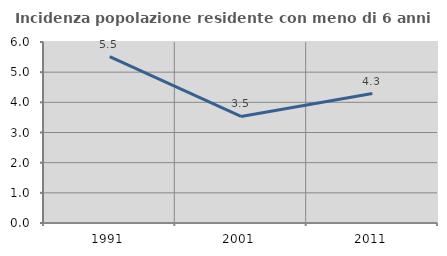
| Category | Incidenza popolazione residente con meno di 6 anni |
|---|---|
| 1991.0 | 5.516 |
| 2001.0 | 3.533 |
| 2011.0 | 4.29 |